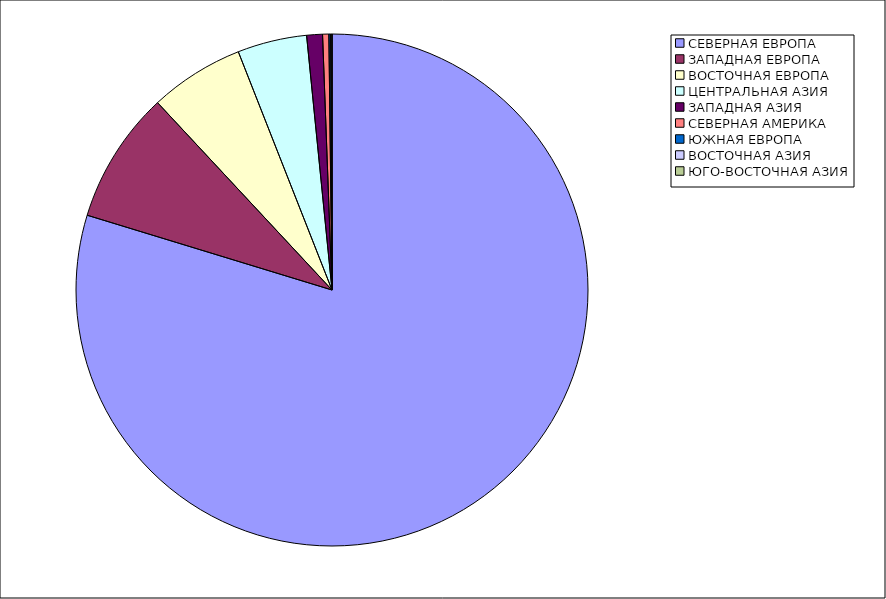
| Category | Оборот |
|---|---|
| СЕВЕРНАЯ ЕВРОПА | 79.718 |
| ЗАПАДНАЯ ЕВРОПА | 8.35 |
| ВОСТОЧНАЯ ЕВРОПА | 5.969 |
| ЦЕНТРАЛЬНАЯ АЗИЯ | 4.38 |
| ЗАПАДНАЯ АЗИЯ | 0.996 |
| СЕВЕРНАЯ АМЕРИКА | 0.394 |
| ЮЖНАЯ ЕВРОПА | 0.109 |
| ВОСТОЧНАЯ АЗИЯ | 0.085 |
| ЮГО-ВОСТОЧНАЯ АЗИЯ | 0.001 |